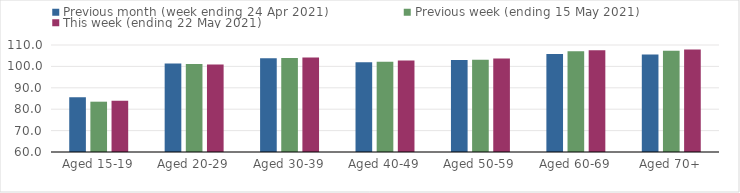
| Category | Previous month (week ending 24 Apr 2021) | Previous week (ending 15 May 2021) | This week (ending 22 May 2021) |
|---|---|---|---|
| Aged 15-19 | 85.63 | 83.51 | 83.95 |
| Aged 20-29 | 101.31 | 101.11 | 100.9 |
| Aged 30-39 | 103.79 | 103.9 | 104.15 |
| Aged 40-49 | 101.96 | 102.15 | 102.74 |
| Aged 50-59 | 102.95 | 103.09 | 103.68 |
| Aged 60-69 | 105.84 | 107.04 | 107.55 |
| Aged 70+ | 105.51 | 107.3 | 107.88 |